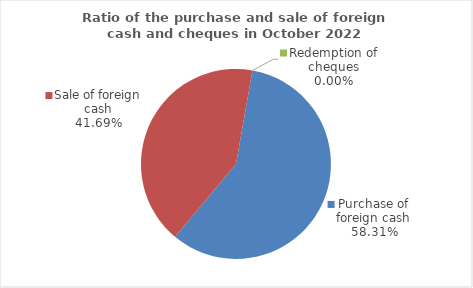
| Category | Series 0 |
|---|---|
| Purchase of foreign cash | 58.308 |
| Sale of foreign cash | 41.692 |
| Redemption of cheques | 0 |